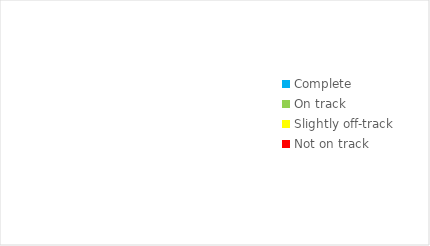
| Category | Series 0 |
|---|---|
| Complete  | 0 |
| On track  | 0 |
| Slightly off-track  | 0 |
| Not on track  | 0 |